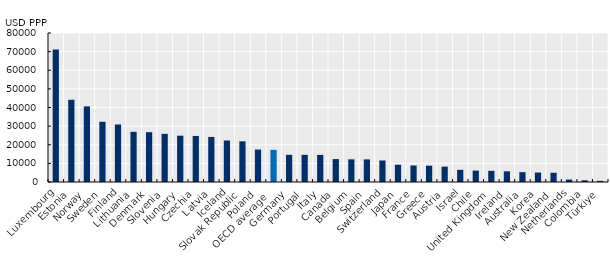
| Category | 2019 |
|---|---|
| Luxembourg | 71207.993 |
| Estonia | 44151.506 |
| Norway | 40599.291 |
| Sweden | 32332.27 |
| Finland | 30879.48 |
| Lithuania | 26938.487 |
| Denmark | 26747.19 |
| Slovenia | 25858.558 |
| Hungary | 24862.671 |
| Czechia | 24717.807 |
| Latvia | 24197.042 |
| Iceland | 22290.194 |
| Slovak Republic | 21842.031 |
| Poland | 17430.927 |
| OECD average  | 17248.364 |
| Germany | 14592.514 |
| Portugal | 14581.529 |
| Italy | 14566.696 |
| Canada | 12305.447 |
| Belgium | 12167.788 |
| Spain | 12133.736 |
| Switzerland | 11557.787 |
| Japan | 9270.256 |
| France | 8871.297 |
| Greece | 8769.23 |
| Austria | 8249.973 |
| Israel | 6539.809 |
| Chile | 6123.265 |
| United Kingdom | 5991.018 |
| Ireland | 5735.291 |
| Australia | 5295.243 |
| Korea | 5101.037 |
| New Zealand | 4960.075 |
| Netherlands | 1306.202 |
| Colombia | 908.593 |
| Türkiye | 610.512 |